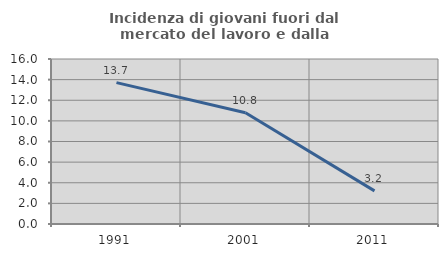
| Category | Incidenza di giovani fuori dal mercato del lavoro e dalla formazione  |
|---|---|
| 1991.0 | 13.707 |
| 2001.0 | 10.791 |
| 2011.0 | 3.213 |